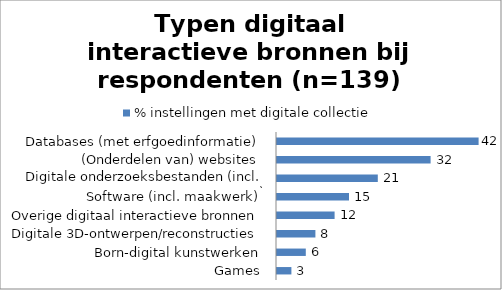
| Category | % instellingen met digitale collectie |
|---|---|
| Games | 3 |
| Born-digital kunstwerken | 6 |
| Digitale 3D-ontwerpen/reconstructies | 8 |
| Overige digitaal interactieve bronnen | 12 |
| Software (incl. maakwerk) | 15 |
| Digitale onderzoeksbestanden (incl. GIS) | 21 |
| (Onderdelen van) websites | 32 |
| Databases (met erfgoedinformatie) | 42 |